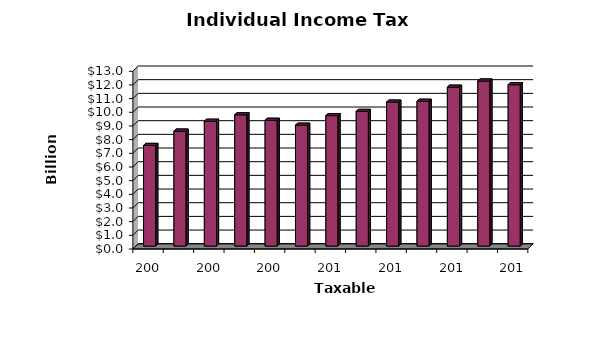
| Category | Series 0 |
|---|---|
| 2004.0 | 7.36 |
| 2005.0 | 8.41 |
| 2006.0 | 9.13 |
| 2007.0 | 9.6 |
| 2008.0 | 9.2 |
| 2009.0 | 8.84 |
| 2010.0 | 9.54 |
| 2011.0 | 9.85 |
| 2012.0 | 10.53 |
| 2013.0 | 10.59 |
| 2014.0 | 11.62 |
| 2015.0 | 12.071 |
| 2016.0 | 11.801 |